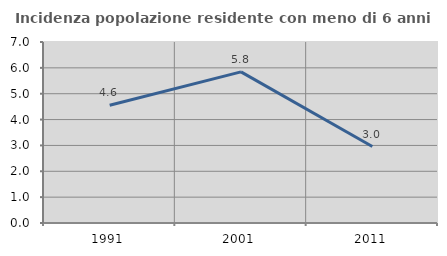
| Category | Incidenza popolazione residente con meno di 6 anni |
|---|---|
| 1991.0 | 4.556 |
| 2001.0 | 5.844 |
| 2011.0 | 2.957 |